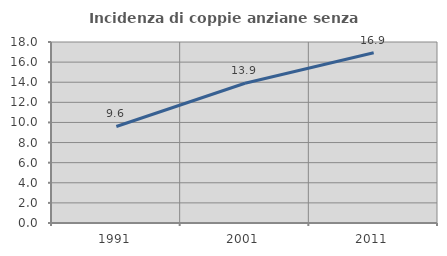
| Category | Incidenza di coppie anziane senza figli  |
|---|---|
| 1991.0 | 9.6 |
| 2001.0 | 13.901 |
| 2011.0 | 16.936 |